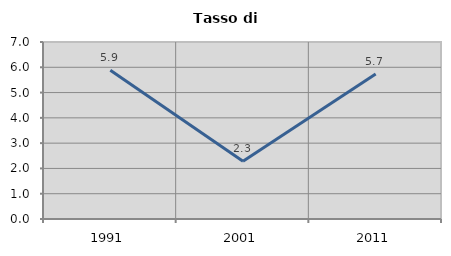
| Category | Tasso di disoccupazione   |
|---|---|
| 1991.0 | 5.882 |
| 2001.0 | 2.28 |
| 2011.0 | 5.735 |